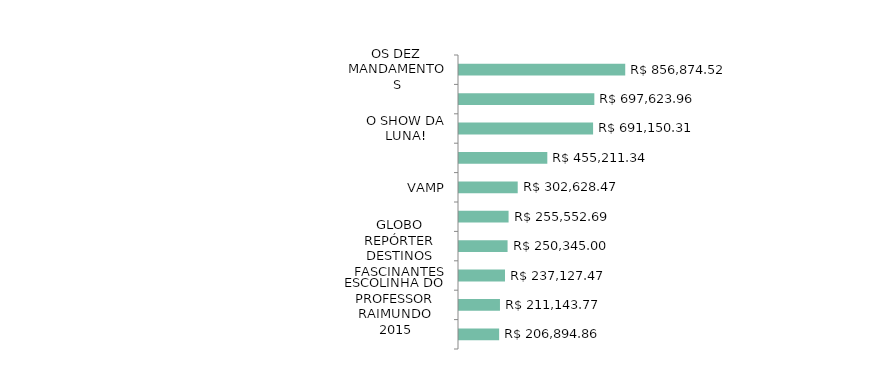
| Category | Series 0 |
|---|---|
| OS DEZ MANDAMENTOS | 856874.52 |
| GALINHA PINTADINHA - 10 ANOS | 697623.96 |
| O SHOW DA LUNA! | 691150.31 |
| VERDADES SECRETAS | 455211.34 |
| VAMP | 302628.47 |
| ATÉ QUE A SORTE NOS SEPARE 3 | 255552.69 |
| GLOBO REPÓRTER DESTINOS FASCINANTES IV | 250345 |
| PAI HERÓI | 237127.47 |
| ESCOLINHA DO PROFESSOR RAIMUNDO 2015 | 211143.77 |
| CHICO - ARTISTA BRASILEIRO | 206894.86 |